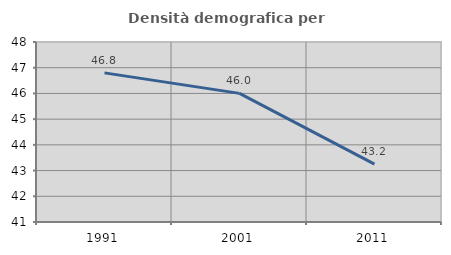
| Category | Densità demografica |
|---|---|
| 1991.0 | 46.799 |
| 2001.0 | 46.002 |
| 2011.0 | 43.249 |